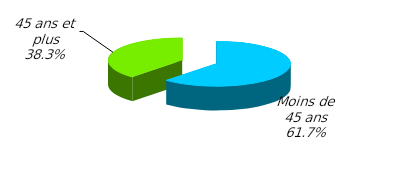
| Category | Series 0 |
|---|---|
| Moins de 45 ans | 0.617 |
| 45 ans et plus | 0.383 |